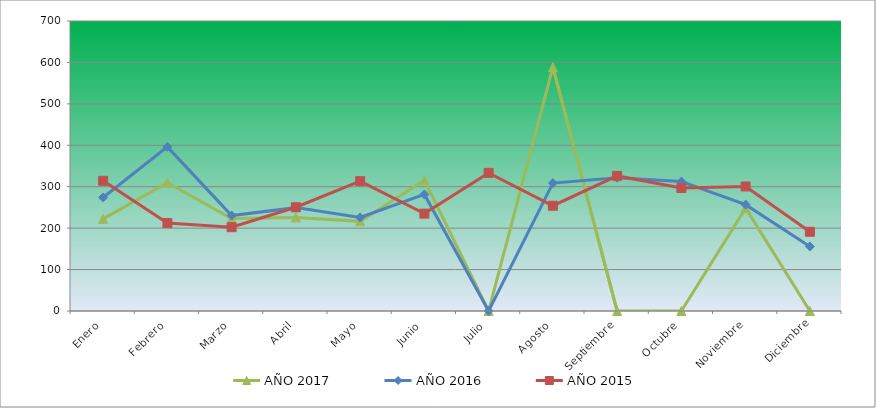
| Category | AÑO 2017 | AÑO 2016 | AÑO 2015 |
|---|---|---|---|
| Enero | 222.436 | 274.08 | 314.257 |
| Febrero | 309.853 | 396.095 | 212.238 |
| Marzo | 223.302 | 230.373 | 202.218 |
| Abril | 225.898 | 249.494 | 250.495 |
| Mayo | 216.378 | 225.82 | 313.347 |
| Junio | 315.911 | 281.364 | 235.01 |
| Julio | 0 | 0 | 333.386 |
| Agosto | 588.547 | 308.681 | 254.139 |
| Septiembre | 0 | 321.429 | 326.099 |
| Octubre | 0 | 312.323 | 296.95 |
| Noviembre | 248.401 | 256.779 | 300.594 |
| Diciembre | 0 | 155.706 | 191.287 |